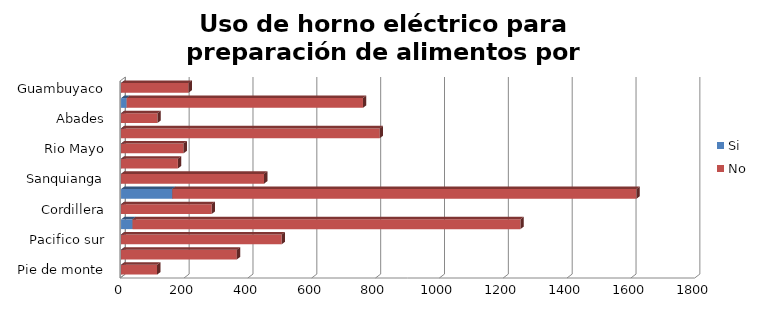
| Category | Si | No |
|---|---|---|
| Pie de monte | 0 | 113 |
| Occidente | 0 | 362.67 |
| Pacifico sur | 0 | 503.25 |
| Ex Provincia | 36.083 | 1215.057 |
| Cordillera | 0 | 284 |
| Centro | 160.663 | 1453.837 |
| Sanquianga | 0 | 448.16 |
| Sabana | 0 | 178.07 |
| Rio Mayo | 0 | 195.78 |
| Telembi | 0 | 810.54 |
| Abades | 0 | 113.96 |
| Juanambu | 17.578 | 740.322 |
| Guambuyaco | 0 | 211.54 |